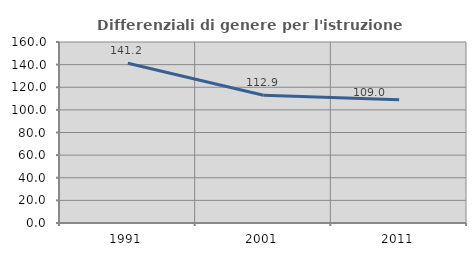
| Category | Differenziali di genere per l'istruzione superiore |
|---|---|
| 1991.0 | 141.161 |
| 2001.0 | 112.913 |
| 2011.0 | 109.019 |